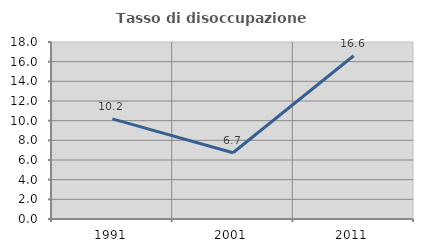
| Category | Tasso di disoccupazione giovanile  |
|---|---|
| 1991.0 | 10.181 |
| 2001.0 | 6.734 |
| 2011.0 | 16.598 |